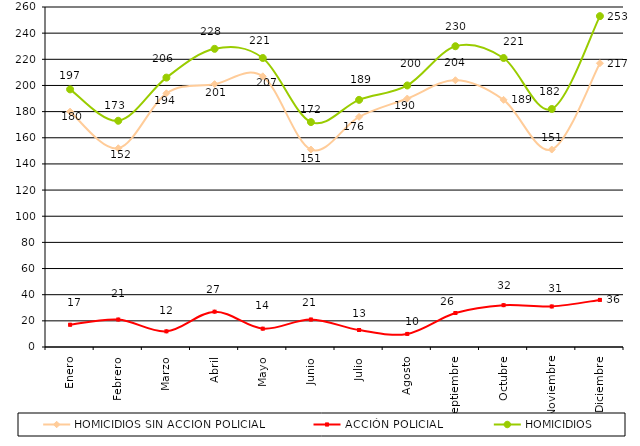
| Category | HOMICIDIOS SIN ACCION POLICIAL | ACCIÓN POLICIAL | HOMICIDIOS |
|---|---|---|---|
| Enero | 180 | 17 | 197 |
| Febrero | 152 | 21 | 173 |
| Marzo | 194 | 12 | 206 |
| Abril | 201 | 27 | 228 |
| Mayo | 207 | 14 | 221 |
| Junio | 151 | 21 | 172 |
| Julio | 176 | 13 | 189 |
| Agosto | 190 | 10 | 200 |
| Septiembre | 204 | 26 | 230 |
| Octubre | 189 | 32 | 221 |
| Noviembre | 151 | 31 | 182 |
| Diciembre | 217 | 36 | 253 |